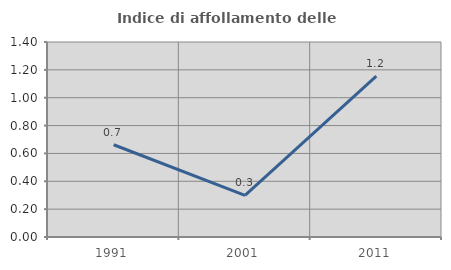
| Category | Indice di affollamento delle abitazioni  |
|---|---|
| 1991.0 | 0.662 |
| 2001.0 | 0.299 |
| 2011.0 | 1.155 |